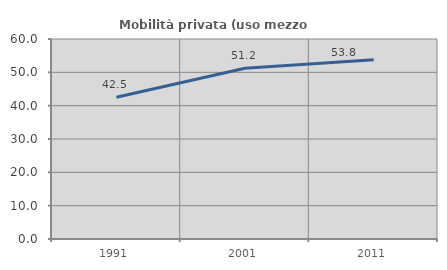
| Category | Mobilità privata (uso mezzo privato) |
|---|---|
| 1991.0 | 42.516 |
| 2001.0 | 51.204 |
| 2011.0 | 53.789 |